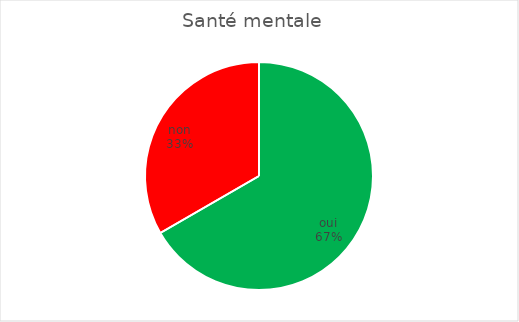
| Category | Santé mentale  (Un soutien est nécessaire pour chaque critère qui n'est pas rempli)  |
|---|---|
| oui | 4 |
| non | 2 |